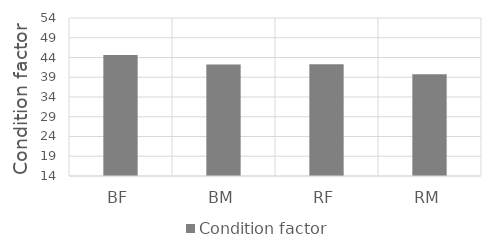
| Category | Condition factor |
|---|---|
| BF | 44.601 |
| BM | 42.208 |
| RF | 42.298 |
| RM | 39.744 |